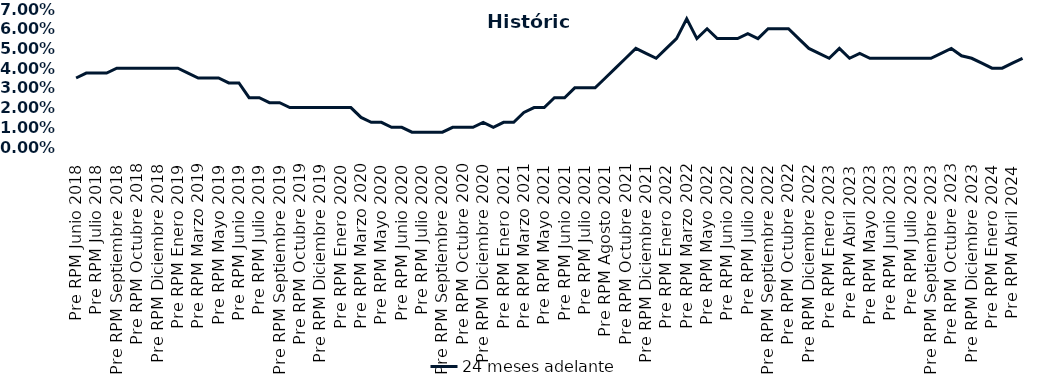
| Category | 24 meses adelante  |
|---|---|
| Pre RPM Junio 2018 | 0.035 |
| Post RPM Junio 2018 | 0.038 |
| Pre RPM Julio 2018 | 0.038 |
| Post RPM Julio 2018 | 0.038 |
| Pre RPM Septiembre 2018 | 0.04 |
| Post RPM Septiembre 2018 | 0.04 |
| Pre RPM Octubre 2018 | 0.04 |
| Post RPM Octubre 2018 | 0.04 |
| Pre RPM Diciembre 2018 | 0.04 |
| Post RPM Diciembre 2018 | 0.04 |
| Pre RPM Enero 2019 | 0.04 |
| Post RPM Enero 2019 | 0.038 |
| Pre RPM Marzo 2019 | 0.035 |
| Post RPM Marzo 2019 | 0.035 |
| Pre RPM Mayo 2019 | 0.035 |
| Post RPM Mayo 2019 | 0.032 |
| Pre RPM Junio 2019 | 0.032 |
| Post RPM Junio 2019 | 0.025 |
| Pre RPM Julio 2019 | 0.025 |
| Post RPM Julio 2019 | 0.022 |
| Pre RPM Septiembre 2019 | 0.022 |
| Post RPM Septiembre 2019 | 0.02 |
| Pre RPM Octubre 2019 | 0.02 |
| Post RPM Octubre 2019 | 0.02 |
| Pre RPM Diciembre 2019 | 0.02 |
| Post RPM Diciembre 2019 | 0.02 |
| Pre RPM Enero 2020 | 0.02 |
| Post RPM Enero 2020 | 0.02 |
| Pre RPM Marzo 2020 | 0.015 |
| Post RPM Marzo 2020 | 0.012 |
| Pre RPM Mayo 2020 | 0.012 |
| Post RPM Mayo 2020 | 0.01 |
| Pre RPM Junio 2020 | 0.01 |
| Post RPM Junio 2020 | 0.008 |
| Pre RPM Julio 2020 | 0.008 |
| Post RPM Julio 2020 | 0.008 |
| Pre RPM Septiembre 2020 | 0.008 |
| Post RPM Septiembre 2020 | 0.01 |
| Pre RPM Octubre 2020 | 0.01 |
| Post RPM Octubre 2020 | 0.01 |
| Pre RPM Diciembre 2020 | 0.012 |
| Post RPM Diciembre 2020 | 0.01 |
| Pre RPM Enero 2021 | 0.012 |
| Post RPM Enero 2021 | 0.012 |
| Pre RPM Marzo 2021 | 0.018 |
| Post RPM Marzo 2021 | 0.02 |
| Pre RPM Mayo 2021 | 0.02 |
| Post RPM Mayo 2021 | 0.025 |
| Pre RPM Junio 2021 | 0.025 |
| Post RPM Junio 2021 | 0.03 |
| Pre RPM Julio 2021 | 0.03 |
| Post RPM Julio 2021 | 0.03 |
| Pre RPM Agosto 2021 | 0.035 |
| Post RPM Agosto 2021 | 0.04 |
| Pre RPM Octubre 2021 | 0.045 |
| Post RPM Octubre 2021 | 0.05 |
| Pre RPM Diciembre 2021 | 0.048 |
| Post RPM Diciembre 2021 | 0.045 |
| Pre RPM Enero 2022 | 0.05 |
| Post RPM Enero 2022 | 0.055 |
| Pre RPM Marzo 2022 | 0.065 |
| Post RPM Marzo 2022 | 0.055 |
| Pre RPM Mayo 2022 | 0.06 |
| Post RPM Mayo 2022 | 0.055 |
| Pre RPM Junio 2022 | 0.055 |
| Post RPM Junio 2022 | 0.055 |
| Pre RPM Julio 2022 | 0.058 |
| Post RPM Julio 2022 | 0.055 |
| Pre RPM Septiembre 2022 | 0.06 |
| Post RPM Septiembre 2022 | 0.06 |
| Pre RPM Octubre 2022 | 0.06 |
| Post RPM Octubre 2022 | 0.055 |
| Pre RPM Diciembre 2022 | 0.05 |
| Post RPM Diciembre 2022 | 0.048 |
| Pre RPM Enero 2023 | 0.045 |
| Post RPM Enero 2023 | 0.05 |
| Pre RPM Abril 2023 | 0.045 |
| Post RPM Abril 2023 | 0.048 |
| Pre RPM Mayo 2023 | 0.045 |
| Post RPM Mayo 2023 | 0.045 |
| Pre RPM Junio 2023 | 0.045 |
| Post RPM Junio 2023 | 0.045 |
| Pre RPM Julio 2023 | 0.045 |
| Post RPM Julio 2023 | 0.045 |
| Pre RPM Septiembre 2023 | 0.045 |
| Post RPM Septiembre 2023 | 0.048 |
| Pre RPM Octubre 2023 | 0.05 |
| Post RPM Octubre 2023 | 0.046 |
| Pre RPM Diciembre 2023 | 0.045 |
| Post RPM Diciembre 2023 | 0.042 |
| Pre RPM Enero 2024 | 0.04 |
| Post RPM Enero 2024 | 0.04 |
| Pre RPM Abril 2024 | 0.042 |
| Post RPM Abril 2024 | 0.045 |